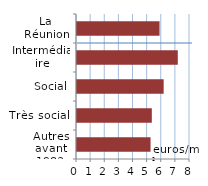
| Category | Series 0 |
|---|---|
| Autres avant 1983 | 5.207 |
| Très social | 5.297 |
| Social | 6.135 |
| Intermédiaire | 7.135 |
| La Réunion | 5.844 |